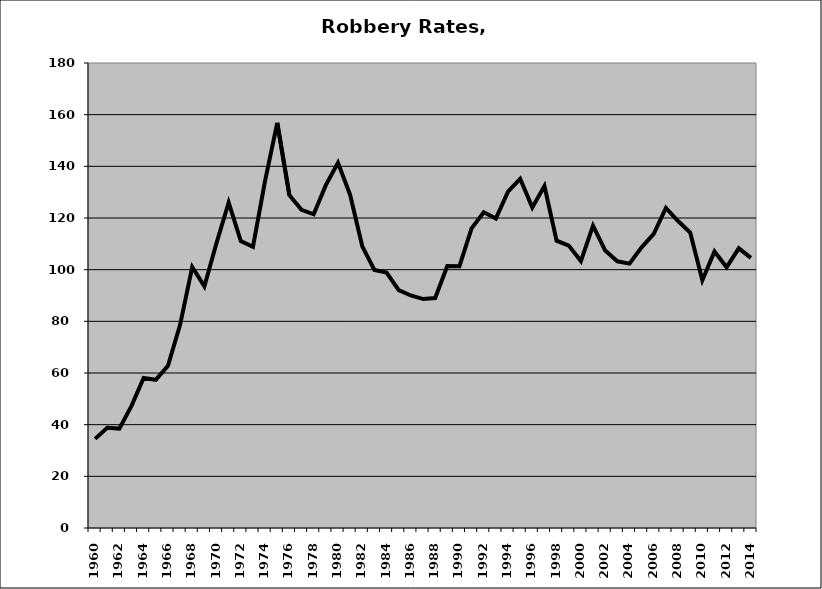
| Category | Robbery |
|---|---|
| 1960.0 | 34.509 |
| 1961.0 | 38.824 |
| 1962.0 | 38.473 |
| 1963.0 | 47.273 |
| 1964.0 | 58.073 |
| 1965.0 | 57.359 |
| 1966.0 | 62.81 |
| 1967.0 | 78.66 |
| 1968.0 | 101.026 |
| 1969.0 | 93.552 |
| 1970.0 | 110.307 |
| 1971.0 | 126.014 |
| 1972.0 | 111.094 |
| 1973.0 | 108.822 |
| 1974.0 | 134.447 |
| 1975.0 | 156.807 |
| 1976.0 | 128.819 |
| 1977.0 | 123.171 |
| 1978.0 | 121.437 |
| 1979.0 | 132.722 |
| 1980.0 | 141.363 |
| 1981.0 | 128.979 |
| 1982.0 | 109.048 |
| 1983.0 | 99.909 |
| 1984.0 | 98.854 |
| 1985.0 | 92.108 |
| 1986.0 | 90.007 |
| 1987.0 | 88.61 |
| 1988.0 | 89.022 |
| 1989.0 | 101.395 |
| 1990.0 | 101.35 |
| 1991.0 | 115.971 |
| 1992.0 | 122.236 |
| 1993.0 | 119.814 |
| 1994.0 | 130.216 |
| 1995.0 | 135.171 |
| 1996.0 | 124.105 |
| 1997.0 | 132.384 |
| 1998.0 | 111.222 |
| 1999.0 | 109.307 |
| 2000.0 | 103.314 |
| 2001.0 | 117.044 |
| 2002.0 | 107.391 |
| 2003.0 | 103.249 |
| 2004.0 | 102.352 |
| 2005.0 | 108.665 |
| 2006.0 | 113.819 |
| 2007.0 | 123.871 |
| 2008.0 | 118.826 |
| 2009.0 | 114.384 |
| 2010.0 | 95.916 |
| 2011.0 | 107.069 |
| 2012.0 | 100.967 |
| 2013.0 | 108.268 |
| 2014.0 | 104.55 |